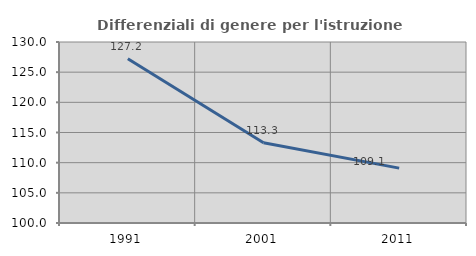
| Category | Differenziali di genere per l'istruzione superiore |
|---|---|
| 1991.0 | 127.232 |
| 2001.0 | 113.285 |
| 2011.0 | 109.097 |